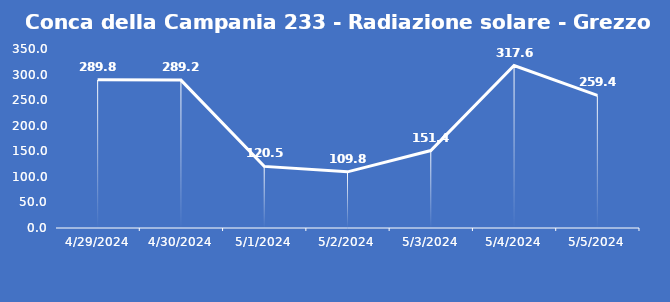
| Category | Conca della Campania 233 - Radiazione solare - Grezzo (W/m2) |
|---|---|
| 4/29/24 | 289.8 |
| 4/30/24 | 289.2 |
| 5/1/24 | 120.5 |
| 5/2/24 | 109.8 |
| 5/3/24 | 151.4 |
| 5/4/24 | 317.6 |
| 5/5/24 | 259.4 |